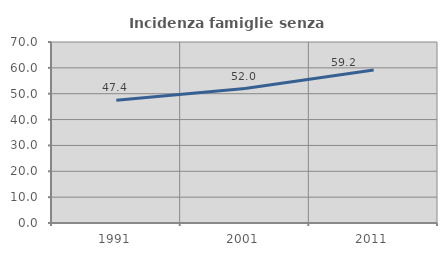
| Category | Incidenza famiglie senza nuclei |
|---|---|
| 1991.0 | 47.442 |
| 2001.0 | 51.98 |
| 2011.0 | 59.184 |